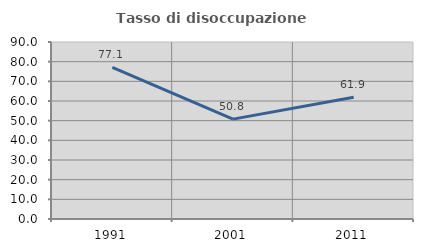
| Category | Tasso di disoccupazione giovanile  |
|---|---|
| 1991.0 | 77.143 |
| 2001.0 | 50.794 |
| 2011.0 | 61.905 |